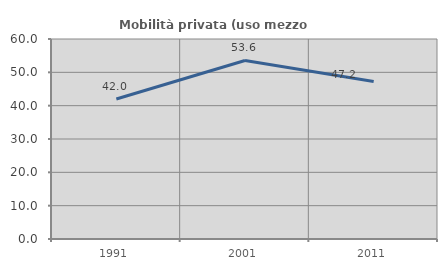
| Category | Mobilità privata (uso mezzo privato) |
|---|---|
| 1991.0 | 42 |
| 2001.0 | 53.552 |
| 2011.0 | 47.236 |